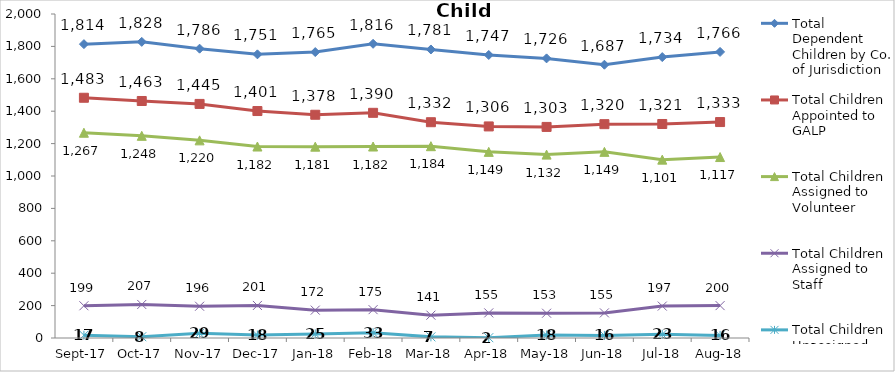
| Category | Total Dependent Children by Co. of Jurisdiction | Total Children Appointed to GALP | Total Children Assigned to Volunteer | Total Children Assigned to Staff | Total Children Unassigned |
|---|---|---|---|---|---|
| 2017-09-01 | 1814 | 1483 | 1267 | 199 | 17 |
| 2017-10-01 | 1828 | 1463 | 1248 | 207 | 8 |
| 2017-11-01 | 1786 | 1445 | 1220 | 196 | 29 |
| 2017-12-01 | 1751 | 1401 | 1182 | 201 | 18 |
| 2018-01-01 | 1765 | 1378 | 1181 | 172 | 25 |
| 2018-02-01 | 1816 | 1390 | 1182 | 175 | 33 |
| 2018-03-01 | 1781 | 1332 | 1184 | 141 | 7 |
| 2018-04-01 | 1747 | 1306 | 1149 | 155 | 2 |
| 2018-05-01 | 1726 | 1303 | 1132 | 153 | 18 |
| 2018-06-01 | 1687 | 1320 | 1149 | 155 | 16 |
| 2018-07-01 | 1734 | 1321 | 1101 | 197 | 23 |
| 2018-08-01 | 1766 | 1333 | 1117 | 200 | 16 |